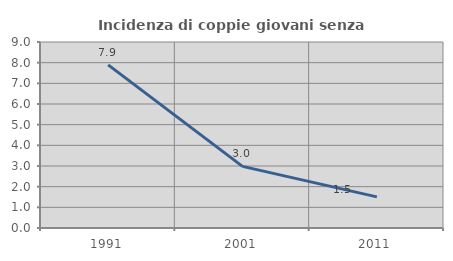
| Category | Incidenza di coppie giovani senza figli |
|---|---|
| 1991.0 | 7.895 |
| 2001.0 | 2.98 |
| 2011.0 | 1.506 |